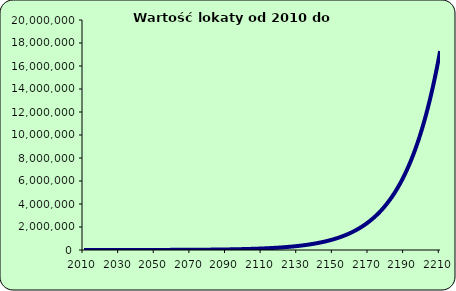
| Category | Series 0 |
|---|---|
| 2010.0 | 1000 |
| 2011.0 | 1050 |
| 2012.0 | 1102.5 |
| 2013.0 | 1157.625 |
| 2014.0 | 1215.506 |
| 2015.0 | 1276.282 |
| 2016.0 | 1340.096 |
| 2017.0 | 1407.1 |
| 2018.0 | 1477.455 |
| 2019.0 | 1551.328 |
| 2020.0 | 1628.895 |
| 2021.0 | 1710.339 |
| 2022.0 | 1795.856 |
| 2023.0 | 1885.649 |
| 2024.0 | 1979.932 |
| 2025.0 | 2078.928 |
| 2026.0 | 2182.875 |
| 2027.0 | 2292.018 |
| 2028.0 | 2406.619 |
| 2029.0 | 2526.95 |
| 2030.0 | 2653.298 |
| 2031.0 | 2785.963 |
| 2032.0 | 2925.261 |
| 2033.0 | 3071.524 |
| 2034.0 | 3225.1 |
| 2035.0 | 3386.355 |
| 2036.0 | 3555.673 |
| 2037.0 | 3733.456 |
| 2038.0 | 3920.129 |
| 2039.0 | 4116.136 |
| 2040.0 | 4321.942 |
| 2041.0 | 4538.039 |
| 2042.0 | 4764.941 |
| 2043.0 | 5003.189 |
| 2044.0 | 5253.348 |
| 2045.0 | 5516.015 |
| 2046.0 | 5791.816 |
| 2047.0 | 6081.407 |
| 2048.0 | 6385.477 |
| 2049.0 | 6704.751 |
| 2050.0 | 7039.989 |
| 2051.0 | 7391.988 |
| 2052.0 | 7761.588 |
| 2053.0 | 8149.667 |
| 2054.0 | 8557.15 |
| 2055.0 | 8985.008 |
| 2056.0 | 9434.258 |
| 2057.0 | 9905.971 |
| 2058.0 | 10401.27 |
| 2059.0 | 10921.333 |
| 2060.0 | 11467.4 |
| 2061.0 | 12040.77 |
| 2062.0 | 12642.808 |
| 2063.0 | 13274.949 |
| 2064.0 | 13938.696 |
| 2065.0 | 14635.631 |
| 2066.0 | 15367.412 |
| 2067.0 | 16135.783 |
| 2068.0 | 16942.572 |
| 2069.0 | 17789.701 |
| 2070.0 | 18679.186 |
| 2071.0 | 19613.145 |
| 2072.0 | 20593.802 |
| 2073.0 | 21623.493 |
| 2074.0 | 22704.667 |
| 2075.0 | 23839.901 |
| 2076.0 | 25031.896 |
| 2077.0 | 26283.49 |
| 2078.0 | 27597.665 |
| 2079.0 | 28977.548 |
| 2080.0 | 30426.426 |
| 2081.0 | 31947.747 |
| 2082.0 | 33545.134 |
| 2083.0 | 35222.391 |
| 2084.0 | 36983.51 |
| 2085.0 | 38832.686 |
| 2086.0 | 40774.32 |
| 2087.0 | 42813.036 |
| 2088.0 | 44953.688 |
| 2089.0 | 47201.372 |
| 2090.0 | 49561.441 |
| 2091.0 | 52039.513 |
| 2092.0 | 54641.489 |
| 2093.0 | 57373.563 |
| 2094.0 | 60242.241 |
| 2095.0 | 63254.353 |
| 2096.0 | 66417.071 |
| 2097.0 | 69737.925 |
| 2098.0 | 73224.821 |
| 2099.0 | 76886.062 |
| 2100.0 | 80730.365 |
| 2101.0 | 84766.883 |
| 2102.0 | 89005.227 |
| 2103.0 | 93455.489 |
| 2104.0 | 98128.263 |
| 2105.0 | 103034.676 |
| 2106.0 | 108186.41 |
| 2107.0 | 113595.731 |
| 2108.0 | 119275.517 |
| 2109.0 | 125239.293 |
| 2110.0 | 131501.258 |
| 2111.0 | 138076.321 |
| 2112.0 | 144980.137 |
| 2113.0 | 152229.144 |
| 2114.0 | 159840.601 |
| 2115.0 | 167832.631 |
| 2116.0 | 176224.262 |
| 2117.0 | 185035.475 |
| 2118.0 | 194287.249 |
| 2119.0 | 204001.612 |
| 2120.0 | 214201.692 |
| 2121.0 | 224911.777 |
| 2122.0 | 236157.366 |
| 2123.0 | 247965.234 |
| 2124.0 | 260363.496 |
| 2125.0 | 273381.671 |
| 2126.0 | 287050.754 |
| 2127.0 | 301403.292 |
| 2128.0 | 316473.456 |
| 2129.0 | 332297.129 |
| 2130.0 | 348911.986 |
| 2131.0 | 366357.585 |
| 2132.0 | 384675.464 |
| 2133.0 | 403909.237 |
| 2134.0 | 424104.699 |
| 2135.0 | 445309.934 |
| 2136.0 | 467575.431 |
| 2137.0 | 490954.203 |
| 2138.0 | 515501.913 |
| 2139.0 | 541277.008 |
| 2140.0 | 568340.859 |
| 2141.0 | 596757.902 |
| 2142.0 | 626595.797 |
| 2143.0 | 657925.587 |
| 2144.0 | 690821.866 |
| 2145.0 | 725362.959 |
| 2146.0 | 761631.107 |
| 2147.0 | 799712.662 |
| 2148.0 | 839698.296 |
| 2149.0 | 881683.21 |
| 2150.0 | 925767.371 |
| 2151.0 | 972055.739 |
| 2152.0 | 1020658.526 |
| 2153.0 | 1071691.453 |
| 2154.0 | 1125276.025 |
| 2155.0 | 1181539.827 |
| 2156.0 | 1240616.818 |
| 2157.0 | 1302647.659 |
| 2158.0 | 1367780.042 |
| 2159.0 | 1436169.044 |
| 2160.0 | 1507977.496 |
| 2161.0 | 1583376.371 |
| 2162.0 | 1662545.189 |
| 2163.0 | 1745672.449 |
| 2164.0 | 1832956.071 |
| 2165.0 | 1924603.875 |
| 2166.0 | 2020834.069 |
| 2167.0 | 2121875.772 |
| 2168.0 | 2227969.561 |
| 2169.0 | 2339368.039 |
| 2170.0 | 2456336.441 |
| 2171.0 | 2579153.263 |
| 2172.0 | 2708110.926 |
| 2173.0 | 2843516.472 |
| 2174.0 | 2985692.296 |
| 2175.0 | 3134976.91 |
| 2176.0 | 3291725.756 |
| 2177.0 | 3456312.044 |
| 2178.0 | 3629127.646 |
| 2179.0 | 3810584.028 |
| 2180.0 | 4001113.23 |
| 2181.0 | 4201168.891 |
| 2182.0 | 4411227.336 |
| 2183.0 | 4631788.703 |
| 2184.0 | 4863378.138 |
| 2185.0 | 5106547.045 |
| 2186.0 | 5361874.397 |
| 2187.0 | 5629968.117 |
| 2188.0 | 5911466.522 |
| 2189.0 | 6207039.849 |
| 2190.0 | 6517391.841 |
| 2191.0 | 6843261.433 |
| 2192.0 | 7185424.505 |
| 2193.0 | 7544695.73 |
| 2194.0 | 7921930.516 |
| 2195.0 | 8318027.042 |
| 2196.0 | 8733928.394 |
| 2197.0 | 9170624.814 |
| 2198.0 | 9629156.055 |
| 2199.0 | 10110613.857 |
| 2200.0 | 10616144.55 |
| 2201.0 | 11146951.778 |
| 2202.0 | 11704299.367 |
| 2203.0 | 12289514.335 |
| 2204.0 | 12903990.052 |
| 2205.0 | 13549189.554 |
| 2206.0 | 14226649.032 |
| 2207.0 | 14937981.484 |
| 2208.0 | 15684880.558 |
| 2209.0 | 16469124.586 |
| 2210.0 | 17292580.815 |